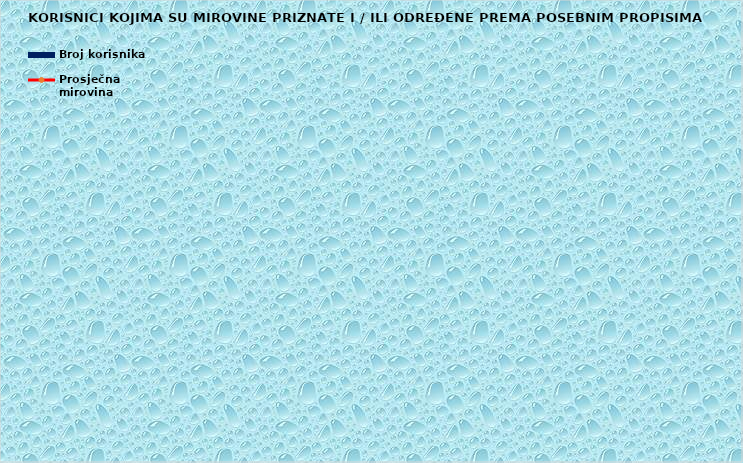
| Category | Broj korisnika |
|---|---|
| Radnici na poslovima ovlaštenih službenih osoba u tijelima unutarnjih poslova i  pravosuđa, kao i na poslovima razminiranja: | 17264 |
| Djelatne vojne osobe - DVO  | 15640 |
| Pripadnici Hrvatske domovinske vojske od 1941. do 1945. godine | 3976 |
| Bivši politički zatvorenici | 2795 |
| Hrvatski branitelji iz Domovinskog rata - ZOHBDR | 71253 |
| Mirovine priznate prema općim propisima, a određene prema
ZOHBDR - u iz 2017. (čl. 27., 35., 48. i 49. stavak 2.)  | 43071 |
| Pripadnici bivše Jugoslavenske narodne armije - JNA | 5368 |
| Pripadnici bivše Jugoslavenske narodne armije - JNA - čl. 185 ZOMO | 142 |
| Sudionici Narodnooslobodilačkog rata - NOR | 9476 |
| Zastupnici u Hrvatskom saboru, članovi Vlade, suci Ustavnog suda i glavni državni revizor  | 673 |
| Članovi Izvršnog vijeća Sabora, Saveznog izvršnog vijeća i administrativno umirovljeni javni službenici | 94 |
| Bivši službenici u saveznim tijelima bivše SFRJ - članak 38. ZOMO | 33 |
| Redoviti članovi Hrvatske akademije znanosti i umjetnosti - HAZU | 140 |
| Radnici u Istarskim ugljenokopima "Tupljak" d.d. Labin  | 254 |
| Radnici profesionalno izloženi azbestu | 869 |
| Osiguranici - članovi posade broda u međunarodnoj plovidbi i nacionalnoj plovidbi - članak 129. a stavak 2. Pomorskog zakonika | 178 |
| Pripadnici Hrvatskog vijeća obrane  - HVO  | 6725 |